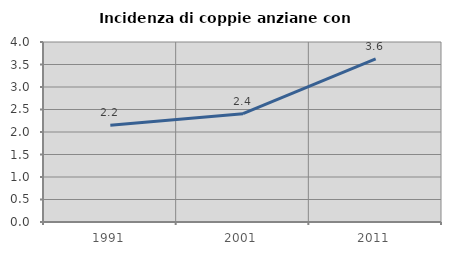
| Category | Incidenza di coppie anziane con figli |
|---|---|
| 1991.0 | 2.151 |
| 2001.0 | 2.407 |
| 2011.0 | 3.625 |